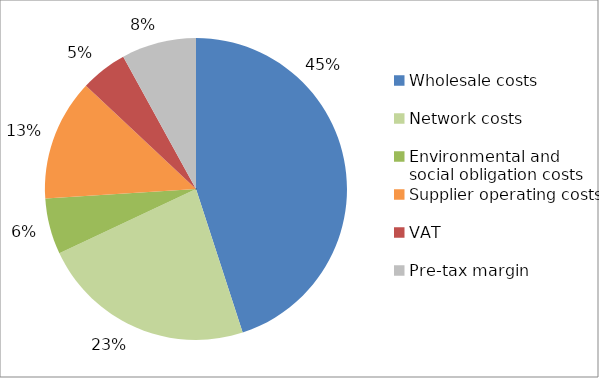
| Category | Series 0 |
|---|---|
| Wholesale costs | 0.45 |
| Network costs | 0.23 |
| Environmental and social obligation costs | 0.06 |
| Supplier operating costs | 0.13 |
| VAT | 0.05 |
| Pre-tax margin | 0.08 |